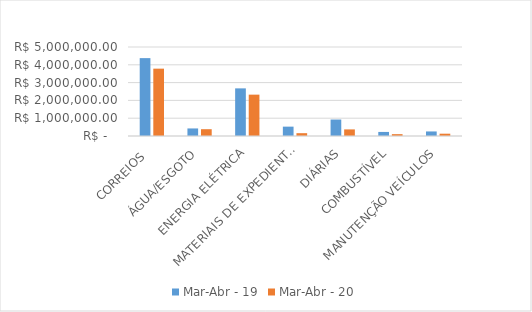
| Category | Mar-Abr - 19 | Mar-Abr - 20 |
|---|---|---|
| CORREIOS  | 4375229.75 | 3783335.46 |
| ÁGUA/ESGOTO | 424366.82 | 381972.47 |
| ENERGIA ELÉTRICA | 2675712.29 | 2323031 |
| MATERIAIS DE EXPEDIENTES | 525695.92 | 158452.43 |
| DIÁRIAS | 925526.62 | 370513.51 |
| COMBUSTÍVEL | 228339.7 | 103888.49 |
| MANUTENÇÃO VEÍCULOS | 255397.35 | 129586.55 |